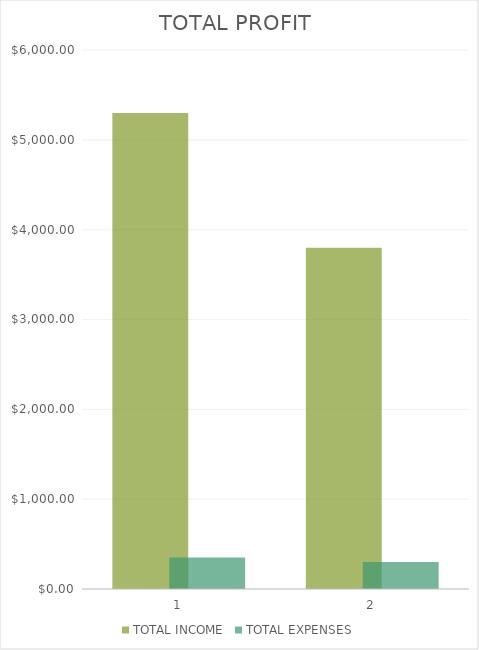
| Category | TOTAL INCOME | TOTAL EXPENSES |
|---|---|---|
| 0 | 5300 | 350 |
| 1 | 3800 | 300 |